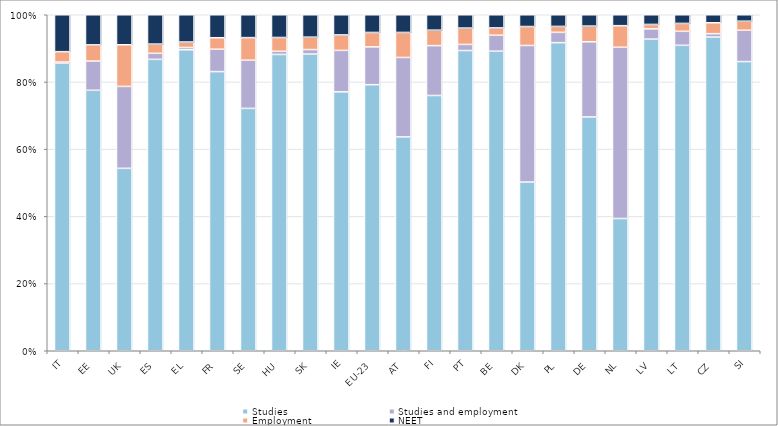
| Category | Studies | Studies and employment | Employment  | NEET |
|---|---|---|---|---|
| IT | 85.573 | 0.349 | 3.09 | 10.988 |
| EE | 77.516 | 8.705 | 4.814 | 8.966 |
| UK | 54.288 | 24.389 | 12.393 | 8.93 |
| ES | 86.722 | 1.798 | 2.744 | 8.736 |
| EL | 89.579 | 0.676 | 1.63 | 8.115 |
| FR | 83.085 | 6.656 | 3.422 | 6.836 |
| SE | 72.128 | 14.34 | 6.728 | 6.804 |
| HU | 88.18 | 0.947 | 4.105 | 6.768 |
| SK | 88.299 | 1.345 | 3.686 | 6.67 |
| IE | 77.055 | 12.34 | 4.598 | 6.007 |
| EU-23 | 79.315 | 11.276 | 4.289 | 5.28 |
| AT | 63.641 | 23.646 | 7.445 | 5.267 |
| FI | 75.972 | 14.841 | 4.594 | 4.594 |
| PT | 89.351 | 1.826 | 4.856 | 3.967 |
| BE | 89.155 | 4.757 | 2.173 | 3.915 |
| DK | 50.206 | 40.65 | 5.642 | 3.502 |
| PL | 91.701 | 3.061 | 1.766 | 3.473 |
| DE | 69.578 | 22.376 | 4.667 | 3.38 |
| NL | 39.359 | 50.966 | 6.421 | 3.254 |
| LV | 92.745 | 3.052 | 1.318 | 2.884 |
| LT | 90.9 | 4.175 | 2.345 | 2.58 |
| CZ | 93.36 | 1.009 | 3.247 | 2.384 |
| SI | 86.066 | 9.325 | 2.68 | 1.929 |